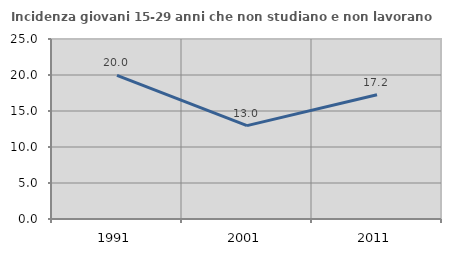
| Category | Incidenza giovani 15-29 anni che non studiano e non lavorano  |
|---|---|
| 1991.0 | 19.96 |
| 2001.0 | 12.972 |
| 2011.0 | 17.248 |